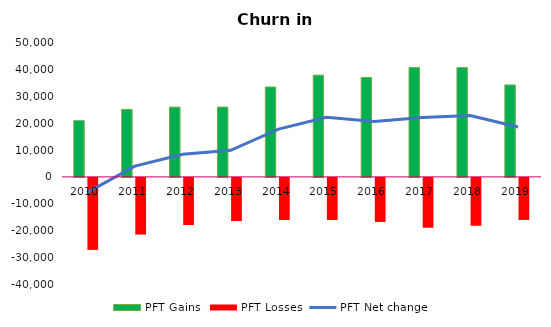
| Category | PFT Gains  | PFT Losses |
|---|---|---|
| 2010.0 | 20999 | -26892 |
| 2011.0 | 25195 | -21166 |
| 2012.0 | 26043 | -17624 |
| 2013.0 | 26065 | -16124 |
| 2014.0 | 33565 | -15732 |
| 2015.0 | 37980 | -15716 |
| 2016.0 | 37145 | -16452 |
| 2017.0 | 40813 | -18613 |
| 2018.0 | 40800 | -17872 |
| 2019.0 | 34324 | -15691 |